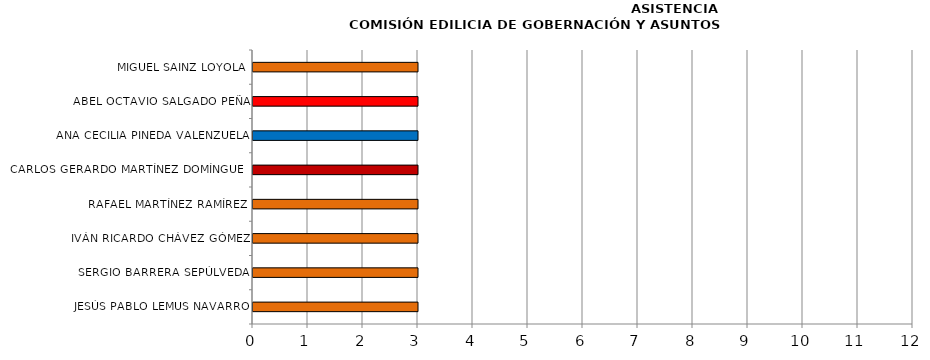
| Category | Series 0 |
|---|---|
| JESÚS PABLO LEMUS NAVARRO | 3 |
| SERGIO BARRERA SEPÚLVEDA | 3 |
| IVÁN RICARDO CHÁVEZ GÓMEZ | 3 |
| RAFAEL MARTÍNEZ RAMÍREZ | 3 |
| CARLOS GERARDO MARTÍNEZ DOMÍNGUEZ | 3 |
| ANA CECILIA PINEDA VALENZUELA | 3 |
| ABEL OCTAVIO SALGADO PEÑA | 3 |
| MIGUEL SAINZ LOYOLA | 3 |